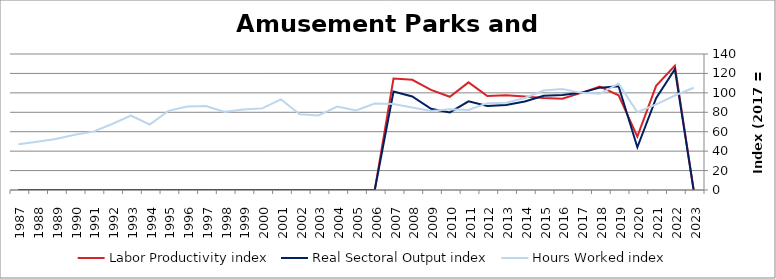
| Category | Labor Productivity index | Real Sectoral Output index | Hours Worked index |
|---|---|---|---|
| 2023.0 | 0 | 0 | 105.287 |
| 2022.0 | 127.903 | 124.412 | 97.271 |
| 2021.0 | 107.251 | 94.612 | 88.215 |
| 2020.0 | 54.913 | 43.993 | 80.113 |
| 2019.0 | 97.45 | 106.76 | 109.553 |
| 2018.0 | 106.465 | 105.382 | 98.983 |
| 2017.0 | 100 | 100 | 100 |
| 2016.0 | 93.918 | 97.679 | 104.005 |
| 2015.0 | 94.722 | 97.032 | 102.439 |
| 2014.0 | 96.202 | 91.137 | 94.735 |
| 2013.0 | 97.459 | 87.456 | 89.736 |
| 2012.0 | 96.71 | 86.464 | 89.405 |
| 2011.0 | 110.815 | 91.291 | 82.381 |
| 2010.0 | 95.994 | 79.914 | 83.248 |
| 2009.0 | 102.986 | 83.675 | 81.249 |
| 2008.0 | 113.404 | 96.239 | 84.864 |
| 2007.0 | 114.663 | 101.411 | 88.443 |
| 2006.0 | 0 | 0 | 88.952 |
| 2005.0 | 0 | 0 | 81.782 |
| 2004.0 | 0 | 0 | 85.842 |
| 2003.0 | 0 | 0 | 76.672 |
| 2002.0 | 0 | 0 | 77.955 |
| 2001.0 | 0 | 0 | 93.227 |
| 2000.0 | 0 | 0 | 84.021 |
| 1999.0 | 0 | 0 | 82.878 |
| 1998.0 | 0 | 0 | 80.434 |
| 1997.0 | 0 | 0 | 86.412 |
| 1996.0 | 0 | 0 | 85.836 |
| 1995.0 | 0 | 0 | 81.443 |
| 1994.0 | 0 | 0 | 67.456 |
| 1993.0 | 0 | 0 | 76.584 |
| 1992.0 | 0 | 0 | 67.927 |
| 1991.0 | 0 | 0 | 60.085 |
| 1990.0 | 0 | 0 | 56.963 |
| 1989.0 | 0 | 0 | 52.449 |
| 1988.0 | 0 | 0 | 49.706 |
| 1987.0 | 0 | 0 | 46.997 |